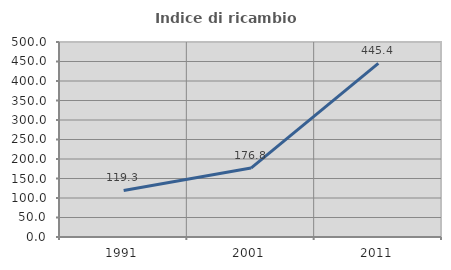
| Category | Indice di ricambio occupazionale  |
|---|---|
| 1991.0 | 119.307 |
| 2001.0 | 176.774 |
| 2011.0 | 445.361 |